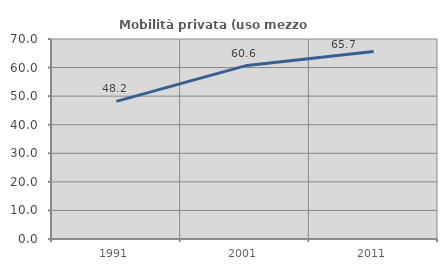
| Category | Mobilità privata (uso mezzo privato) |
|---|---|
| 1991.0 | 48.174 |
| 2001.0 | 60.606 |
| 2011.0 | 65.658 |